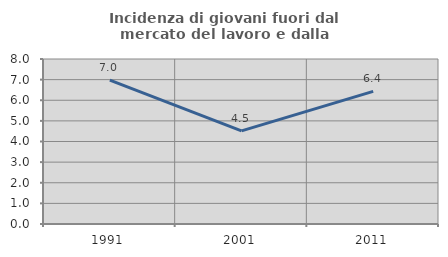
| Category | Incidenza di giovani fuori dal mercato del lavoro e dalla formazione  |
|---|---|
| 1991.0 | 6.973 |
| 2001.0 | 4.513 |
| 2011.0 | 6.429 |